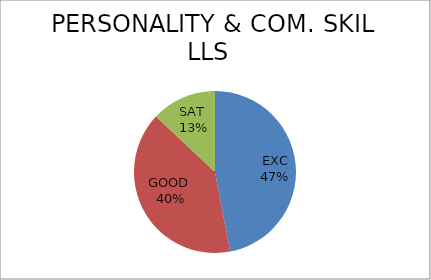
| Category | Series 0 |
|---|---|
| EXC | 47 |
| GOOD  | 40 |
| SAT  | 13 |